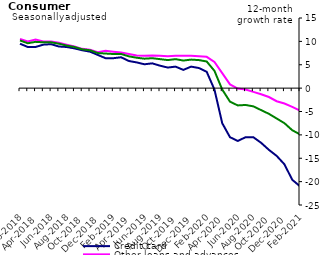
| Category | Credit card | Other loans and advances | Total |
|---|---|---|---|
| Feb-2018 | 9.5 | 10.5 | 10.2 |
| Mar-2018 | 8.8 | 10 | 9.6 |
| Apr-2018 | 8.8 | 10.4 | 9.9 |
| May-2018 | 9.3 | 10 | 9.8 |
| Jun-2018 | 9.4 | 10 | 9.8 |
| Jul-2018 | 8.9 | 9.7 | 9.5 |
| Aug-2018 | 8.8 | 9.3 | 9.1 |
| Sep-2018 | 8.5 | 8.9 | 8.8 |
| Oct-2018 | 8.1 | 8.4 | 8.3 |
| Nov-2018 | 7.8 | 8.2 | 8.1 |
| Dec-2018 | 7.1 | 7.7 | 7.5 |
| Jan-2019 | 6.4 | 8 | 7.4 |
| Feb-2019 | 6.4 | 7.8 | 7.3 |
| Mar-2019 | 6.6 | 7.6 | 7.3 |
| Apr-2019 | 5.8 | 7.3 | 6.8 |
| May-2019 | 5.5 | 7 | 6.5 |
| Jun-2019 | 5.1 | 6.9 | 6.3 |
| Jul-2019 | 5.3 | 7 | 6.4 |
| Aug-2019 | 4.8 | 6.9 | 6.2 |
| Sep-2019 | 4.4 | 6.8 | 6 |
| Oct-2019 | 4.6 | 6.9 | 6.2 |
| Nov-2019 | 3.9 | 6.9 | 5.9 |
| Dec-2019 | 4.6 | 6.9 | 6.1 |
| Jan-2020 | 4.3 | 6.8 | 6 |
| Feb-2020 | 3.5 | 6.7 | 5.7 |
| Mar-2020 | -0.3 | 5.6 | 3.7 |
| Apr-2020 | -7.5 | 3.2 | -0.3 |
| May-2020 | -10.5 | 0.8 | -2.9 |
| Jun-2020 | -11.3 | -0.1 | -3.7 |
| Jul-2020 | -10.5 | -0.3 | -3.6 |
| Aug-2020 | -10.5 | -0.8 | -3.9 |
| Sep-2020 | -11.7 | -1.3 | -4.7 |
| Oct-2020 | -13.2 | -1.9 | -5.5 |
| Nov-2020 | -14.5 | -2.8 | -6.5 |
| Dec-2020 | -16.3 | -3.3 | -7.5 |
| Jan-2021 | -19.6 | -4 | -9 |
| Feb-2021 | -21 | -4.8 | -9.9 |